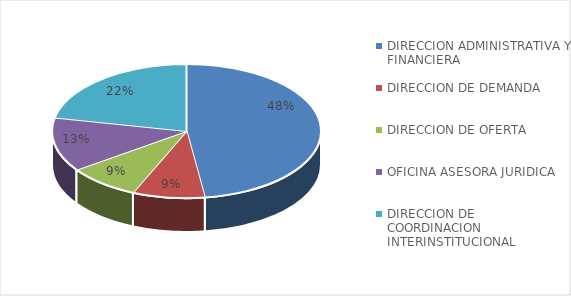
| Category | Series 0 |
|---|---|
| DIRECCION ADMINISTRATIVA Y FINANCIERA | 11 |
| DIRECCION DE DEMANDA | 2 |
| DIRECCION DE OFERTA | 2 |
| OFICINA ASESORA JURIDICA | 3 |
| DIRECCION DE COORDINACION INTERINSTITUCIONAL | 5 |